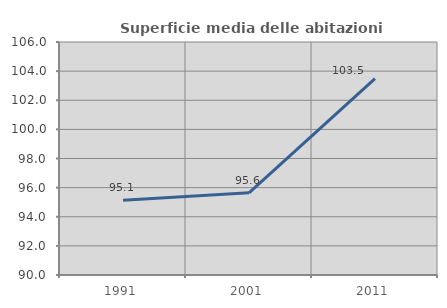
| Category | Superficie media delle abitazioni occupate |
|---|---|
| 1991.0 | 95.137 |
| 2001.0 | 95.64 |
| 2011.0 | 103.492 |